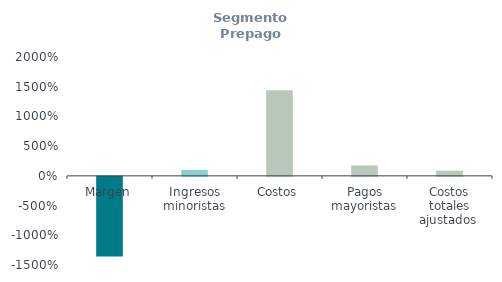
| Category | Segmento Prepago
(% ingresos) |
|---|---|
| Margen | -13.399 |
| Ingresos minoristas | 1 |
| Costos | 14.399 |
| Pagos mayoristas | 1.757 |
| Costos totales ajustados  | 0.878 |